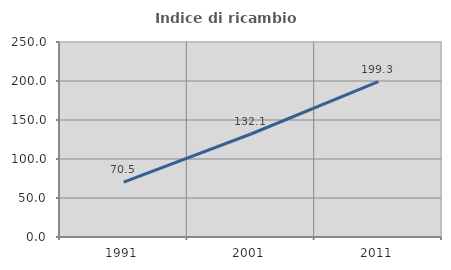
| Category | Indice di ricambio occupazionale  |
|---|---|
| 1991.0 | 70.466 |
| 2001.0 | 132.051 |
| 2011.0 | 199.296 |